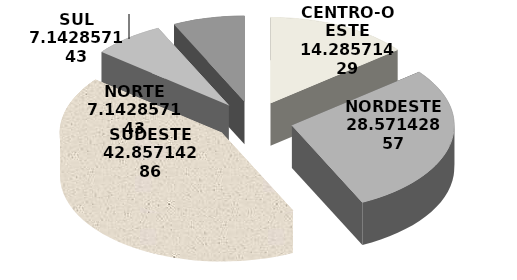
| Category | Series 0 |
|---|---|
| CENTRO-OESTE | 14.286 |
| NORDESTE | 28.571 |
| SUDESTE | 42.857 |
| SUL | 7.143 |
| NORTE | 7.143 |